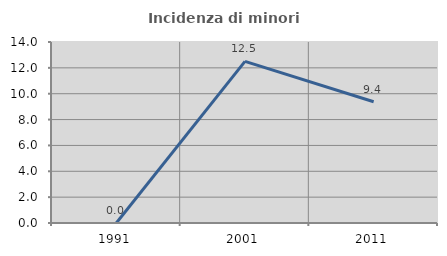
| Category | Incidenza di minori stranieri |
|---|---|
| 1991.0 | 0 |
| 2001.0 | 12.5 |
| 2011.0 | 9.375 |